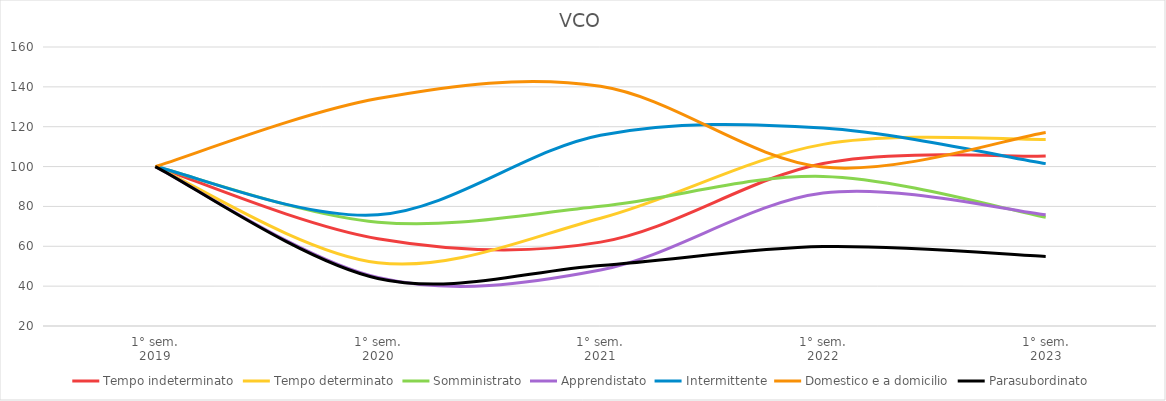
| Category | Tempo indeterminato | Tempo determinato | Somministrato | Apprendistato | Intermittente | Domestico e a domicilio | Parasubordinato |
|---|---|---|---|---|---|---|---|
| 1° sem.
2019 | 100 | 100 | 100 | 100 | 100 | 100 | 100 |
| 1° sem.
2020 | 63.78 | 51.733 | 72.093 | 44.313 | 75.789 | 134.133 | 43.852 |
| 1° sem.
2021 | 62.091 | 74.076 | 80.087 | 48.104 | 115.719 | 140.267 | 50.41 |
| 1° sem.
2022 | 101.584 | 111.147 | 95.058 | 86.73 | 119.298 | 99.733 | 59.836 |
| 1° sem.
2023 | 105.28 | 113.621 | 74.564 | 75.829 | 101.474 | 117.067 | 54.918 |